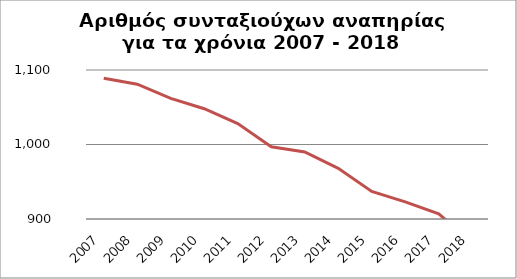
| Category | Series 1 |
|---|---|
| 2007.0 | 1089 |
| 2008.0 | 1081 |
| 2009.0 | 1062 |
| 2010.0 | 1048 |
| 2011.0 | 1028 |
| 2012.0 | 997 |
| 2013.0 | 990 |
| 2014.0 | 968 |
| 2015.0 | 937 |
| 2016.0 | 923 |
| 2017.0 | 907 |
| 2018.0 | 868 |